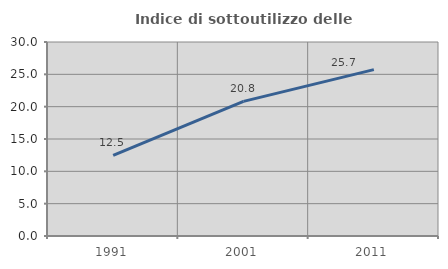
| Category | Indice di sottoutilizzo delle abitazioni  |
|---|---|
| 1991.0 | 12.459 |
| 2001.0 | 20.814 |
| 2011.0 | 25.731 |